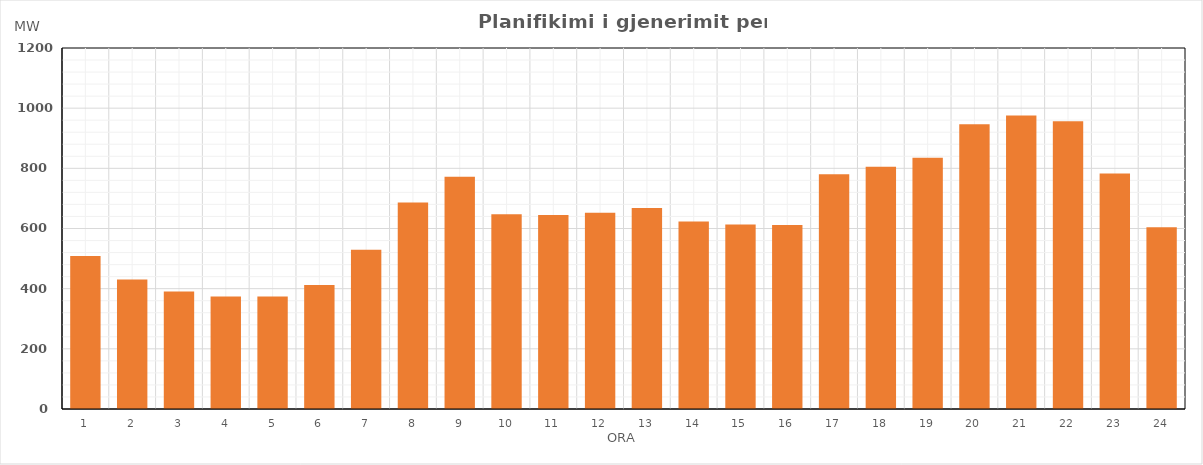
| Category | Max (MW) |
|---|---|
| 0 | 508.54 |
| 1 | 430.41 |
| 2 | 390.6 |
| 3 | 373.79 |
| 4 | 373.88 |
| 5 | 412.27 |
| 6 | 529.24 |
| 7 | 686.36 |
| 8 | 772.36 |
| 9 | 647.06 |
| 10 | 645.16 |
| 11 | 652.76 |
| 12 | 668.16 |
| 13 | 622.96 |
| 14 | 613.46 |
| 15 | 611.96 |
| 16 | 780.66 |
| 17 | 804.86 |
| 18 | 835.26 |
| 19 | 946.16 |
| 20 | 975.77 |
| 21 | 956.37 |
| 22 | 782.77 |
| 23 | 604.07 |